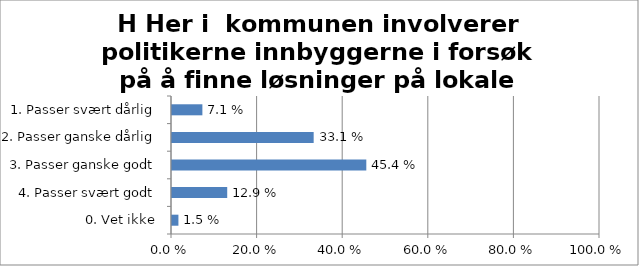
| Category | H Her i  kommunen involverer politikerne innbyggerne i forsøk på å finne løsninger på lokale problemer |
|---|---|
| 1. Passer svært dårlig | 0.071 |
| 2. Passer ganske dårlig | 0.331 |
| 3. Passer ganske godt | 0.454 |
| 4. Passer svært godt | 0.129 |
| 0. Vet ikke | 0.015 |